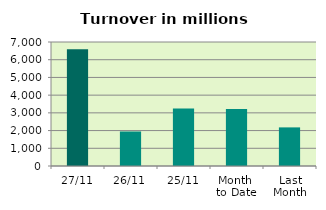
| Category | Series 0 |
|---|---|
| 27/11 | 6597.135 |
| 26/11 | 1948.219 |
| 25/11 | 3240.548 |
| Month 
to Date | 3216.198 |
| Last
Month | 2179.795 |